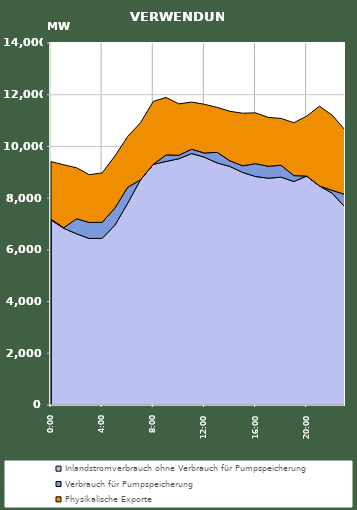
| Category | Inlandstromverbrauch ohne Verbrauch für Pumpspeicherung | Verbrauch für Pumpspeicherung | Physikalische Exporte |
|---|---|---|---|
| 2007-01-17 | 7155.424 | 31.291 | 2224.665 |
| 2007-01-17 01:00:00 | 6832.189 | 25.193 | 2432.184 |
| 2007-01-17 02:00:00 | 6622.242 | 580.54 | 1971.669 |
| 2007-01-17 03:00:00 | 6437.538 | 619.87 | 1849.869 |
| 2007-01-17 04:00:00 | 6445.275 | 620.518 | 1910.538 |
| 2007-01-17 05:00:00 | 6953.152 | 662.483 | 2013.891 |
| 2007-01-17 06:00:00 | 7804.292 | 614.376 | 1966.839 |
| 2007-01-17 07:00:00 | 8708.132 | 0.292 | 2206.792 |
| 2007-01-17 08:00:00 | 9304.682 | 2.826 | 2433.766 |
| 2007-01-17 09:00:00 | 9419.292 | 250.432 | 2223.221 |
| 2007-01-17 10:00:00 | 9523.004 | 134.126 | 1989.665 |
| 2007-01-17 11:00:00 | 9723.61 | 167.544 | 1824.04 |
| 2007-01-17 12:00:00 | 9583.747 | 162.771 | 1883.534 |
| 2007-01-17 13:00:00 | 9361.431 | 409.855 | 1737.126 |
| 2007-01-17 14:00:00 | 9224.998 | 216.951 | 1915.428 |
| 2007-01-17 15:00:00 | 8991.955 | 258.031 | 2034.566 |
| 2007-01-17 16:00:00 | 8836.502 | 497.236 | 1964.398 |
| 2007-01-17 17:00:00 | 8771.428 | 461.482 | 1886.779 |
| 2007-01-17 18:00:00 | 8811.201 | 460.43 | 1813.134 |
| 2007-01-17 19:00:00 | 8644.409 | 226.125 | 2045.455 |
| 2007-01-17 20:00:00 | 8853.011 | 3.023 | 2313.606 |
| 2007-01-17 21:00:00 | 8468.828 | 3.458 | 3083.244 |
| 2007-01-17 22:00:00 | 8191.405 | 109.845 | 2906.179 |
| 2007-01-17 23:00:00 | 7654.069 | 488.9 | 2493.894 |